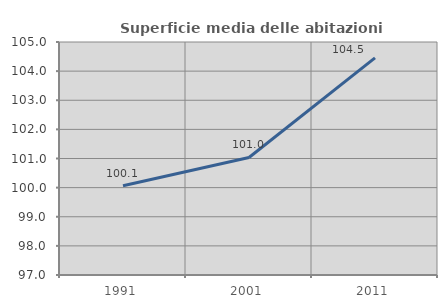
| Category | Superficie media delle abitazioni occupate |
|---|---|
| 1991.0 | 100.063 |
| 2001.0 | 101.035 |
| 2011.0 | 104.456 |